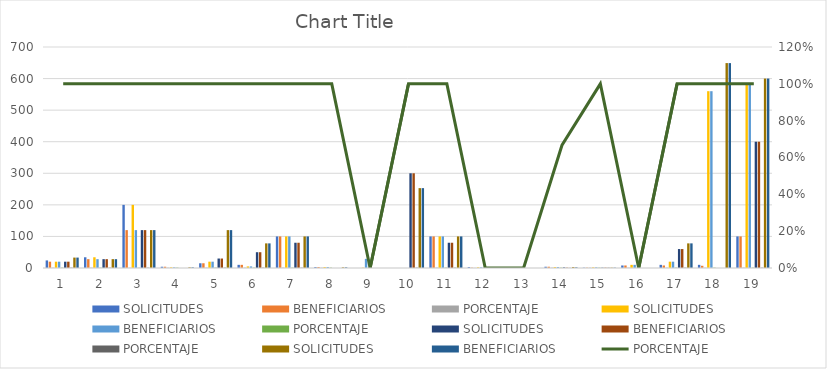
| Category | SOLICITUDES  | BENEFICIARIOS  | PORCENTAJE |
|---|---|---|---|
| 0 | 33 | 33 | 1 |
| 1 | 28 | 28 | 1 |
| 2 | 120 | 120 | 1 |
| 3 | 2 | 2 | 0 |
| 4 | 120 | 120 | 1 |
| 5 | 78 | 78 | 1 |
| 6 | 100 | 100 | 1 |
| 7 | 2 | 2 | 0 |
| 8 | 0 | 0 | 0 |
| 9 | 253 | 253 | 1 |
| 10 | 100 | 100 | 1 |
| 11 | 0 | 0 | 0 |
| 12 | 0 | 0 | 0 |
| 13 | 3 | 2 | 0.5 |
| 14 | 1 | 1 | 1 |
| 15 | 0 | 0 | 0 |
| 16 | 78 | 78 | 1 |
| 17 | 649 | 649 | 0 |
| 18 | 600 | 600 | 1 |